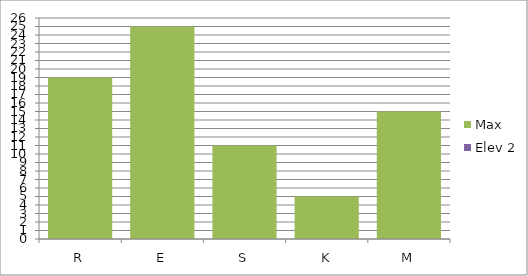
| Category | Max | Elev 2 |
|---|---|---|
| R | 19 | 0 |
| E | 25 | 0 |
| S | 11 | 0 |
| K | 5 | 0 |
| M | 15 | 0 |